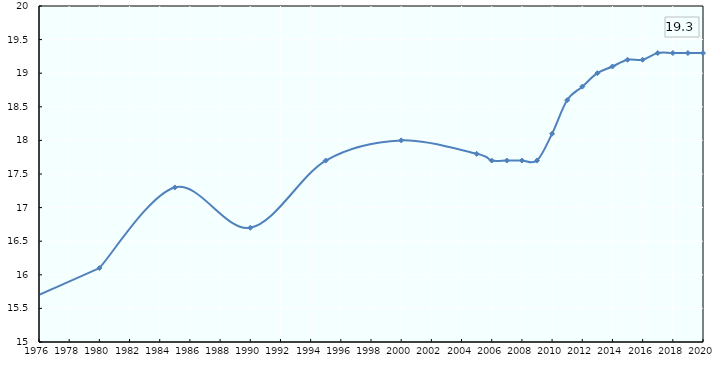
| Category | Unweighted average |
|---|---|
| 1975.0 | 15.6 |
| 1980.0 | 16.1 |
| 1985.0 | 17.3 |
| 1990.0 | 16.7 |
| 1995.0 | 17.7 |
| 2000.0 | 18 |
| 2005.0 | 17.8 |
| 2006.0 | 17.7 |
| 2007.0 | 17.7 |
| 2008.0 | 17.7 |
| 2009.0 | 17.7 |
| 2010.0 | 18.1 |
| 2011.0 | 18.6 |
| 2012.0 | 18.8 |
| 2013.0 | 19 |
| 2014.0 | 19.1 |
| 2015.0 | 19.2 |
| 2016.0 | 19.2 |
| 2017.0 | 19.3 |
| 2018.0 | 19.3 |
| 2019.0 | 19.3 |
| 2020.0 | 19.3 |